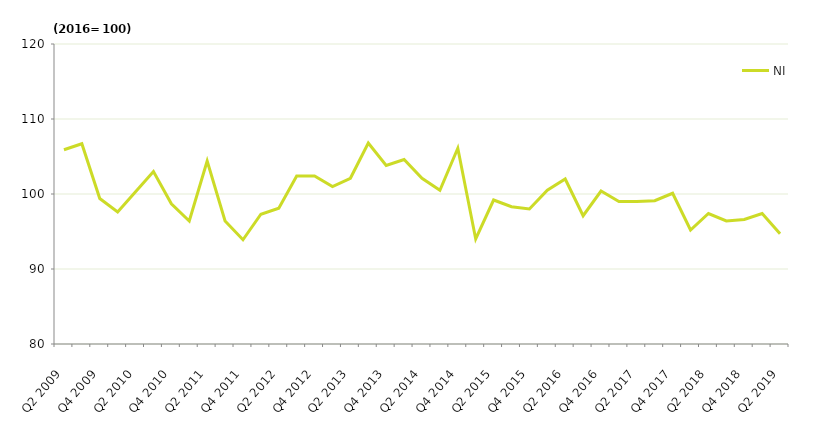
| Category | NI |
|---|---|
| Q2 2009 | 105.9 |
| Q3 2009 | 106.7 |
| Q4 2009 | 99.4 |
| Q1 2010 | 97.6 |
| Q2 2010 | 100.3 |
| Q3 2010 | 103 |
| Q4 2010 | 98.7 |
| Q1 2011 | 96.4 |
| Q2 2011 | 104.4 |
| Q3 2011 | 96.4 |
| Q4 2011 | 93.9 |
| Q1 2012 | 97.3 |
| Q2 2012 | 98.1 |
| Q3 2012 | 102.4 |
| Q4 2012 | 102.4 |
| Q1 2013 | 101 |
| Q2 2013 | 102.1 |
| Q3 2013 | 106.8 |
| Q4 2013 | 103.8 |
| Q1 2014 | 104.6 |
| Q2 2014 | 102.1 |
| Q3 2014 | 100.5 |
| Q4 2014 | 106.1 |
| Q1 2015 | 94 |
| Q2 2015 | 99.2 |
| Q3 2015 | 98.3 |
| Q4 2015 | 98 |
| Q1 2016 | 100.5 |
| Q2 2016 | 102 |
| Q3 2016 | 97.1 |
| Q4 2016 | 100.4 |
| Q1 2017 | 99 |
| Q2 2017 | 99 |
| Q3 2017 | 99.1 |
| Q4 2017 | 100.1 |
| Q1 2018 | 95.2 |
| Q2 2018 | 97.4 |
| Q3 2018 | 96.4 |
| Q4 2018 | 96.6 |
| Q1 2019 | 97.4 |
| Q2 2019 | 94.7 |